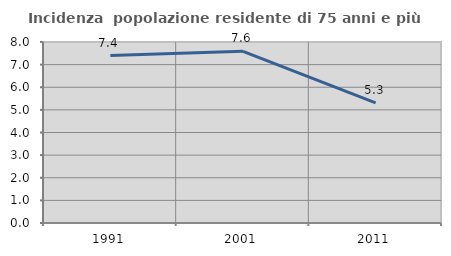
| Category | Incidenza  popolazione residente di 75 anni e più |
|---|---|
| 1991.0 | 7.402 |
| 2001.0 | 7.588 |
| 2011.0 | 5.306 |